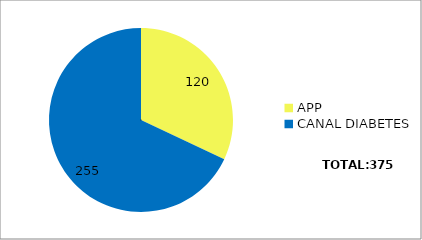
| Category | Series 0 |
|---|---|
| APP | 120 |
| CANAL DIABETES | 255 |